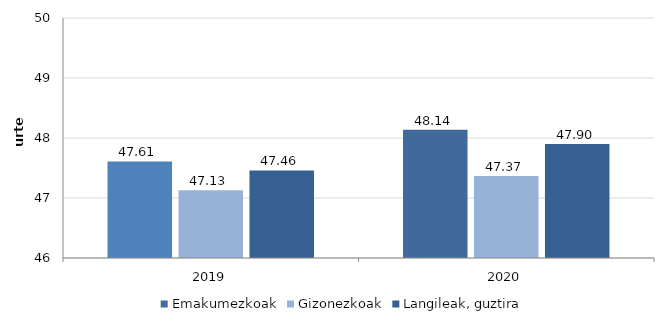
| Category | Emakumezkoak | Gizonezkoak | Langileak, guztira |
|---|---|---|---|
| 2019.0 | 47.61 | 47.13 | 47.46 |
| 2020.0 | 48.137 | 47.366 | 47.899 |